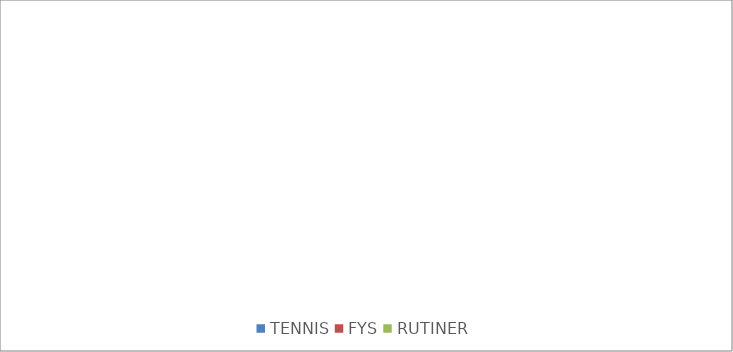
| Category | Series 0 |
|---|---|
| TENNIS | 0 |
| FYS | 0 |
| RUTINER | 0 |